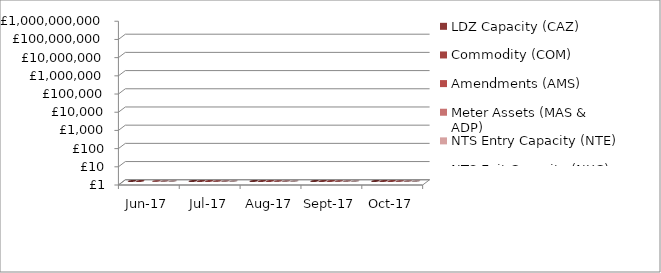
| Category | LDZ Capacity (CAZ) | Commodity (COM) | Amendments (AMS) | Meter Assets (MAS & ADP) | NTS Entry Capacity (NTE) | NTS Exit Capacity (NXC) |
|---|---|---|---|---|---|---|
| 2017-06-01 | 288773735.37 | 16487569.55 | -3258688.63 | 187370.3 | 2007422.43 | 22701563.13 |
| 2017-07-01 | 298593731.84 | 16897919.7 | 247176.37 | 193814.49 | 1970532.91 | 23462413.06 |
| 2017-08-01 | 298862406.46 | 16761360.58 | 1357290.74 | 193840.59 | 1969937.93 | 23465025.38 |
| 2017-09-01 | 289415948.74 | 20098400.73 | 205300.25 | 187587.95 | 1855267.92 | 22811559.53 |
| 2017-10-01 | 299201864.14 | 26855499.51 | 321543.98 | 193840.32 | 11176717.5 | 18097117.82 |